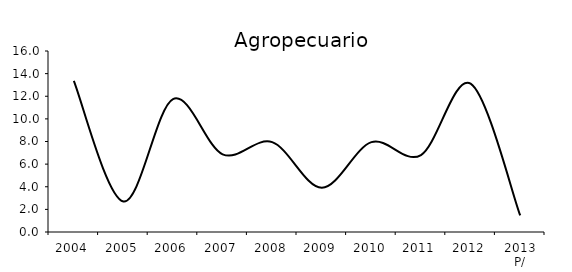
| Category | Agricultura, cría y explotación de animales, aprovechamiento forestal, pesca y caza |
|---|---|
| 2004 | 13.353 |
| 2005 | 2.699 |
| 2006 | 11.75 |
| 2007 | 6.868 |
| 2008 | 7.94 |
| 2009 | 3.913 |
| 2010 | 7.941 |
| 2011 | 6.803 |
| 2012 | 13.11 |
| 2013 P/ | 1.461 |